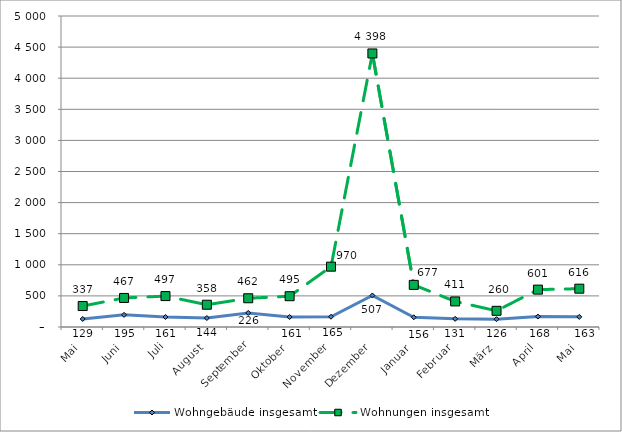
| Category | Wohngebäude insgesamt | Wohnungen insgesamt |
|---|---|---|
| Mai | 129 | 337 |
| Juni | 195 | 467 |
| Juli | 161 | 497 |
| August | 144 | 358 |
| September | 226 | 462 |
| Oktober | 161 | 495 |
| November | 165 | 970 |
| Dezember | 507 | 4398 |
| Januar | 156 | 677 |
| Februar | 131 | 411 |
| März | 126 | 260 |
| April | 168 | 601 |
| Mai | 163 | 616 |